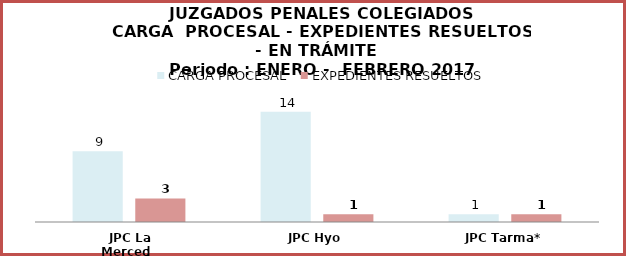
| Category | CARGA PROCESAL | EXPEDIENTES RESUELTOS |
|---|---|---|
| JPC La Merced | 9 | 3 |
| JPC Hyo | 14 | 1 |
| JPC Tarma* | 1 | 1 |